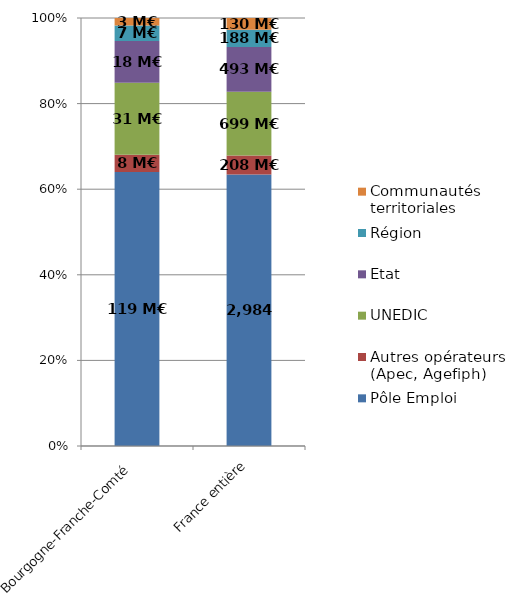
| Category | Pôle Emploi | Autres opérateurs (Apec, Agefiph) | UNEDIC | Etat | Région | Communautés territoriales |
|---|---|---|---|---|---|---|
| Bourgogne-Franche-Comté | 119.185 | 7.548 | 31.355 | 18.15 | 6.713 | 3.263 |
| France entière | 2983.694 | 207.577 | 699.479 | 493.308 | 188.079 | 129.71 |